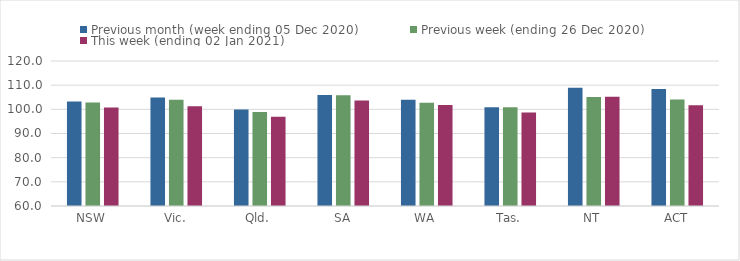
| Category | Previous month (week ending 05 Dec 2020) | Previous week (ending 26 Dec 2020) | This week (ending 02 Jan 2021) |
|---|---|---|---|
| NSW | 103.25 | 102.78 | 100.78 |
| Vic. | 104.93 | 103.97 | 101.27 |
| Qld. | 99.92 | 98.91 | 96.98 |
| SA | 105.95 | 105.83 | 103.67 |
| WA | 103.92 | 102.72 | 101.78 |
| Tas. | 100.86 | 100.88 | 98.67 |
| NT | 108.96 | 105.07 | 105.2 |
| ACT | 108.4 | 104.06 | 101.71 |